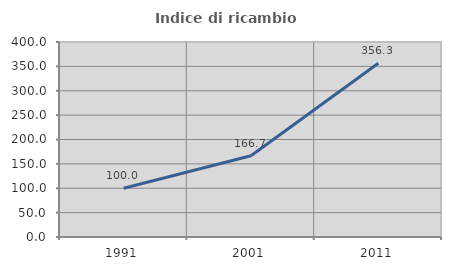
| Category | Indice di ricambio occupazionale  |
|---|---|
| 1991.0 | 100 |
| 2001.0 | 166.667 |
| 2011.0 | 356.25 |